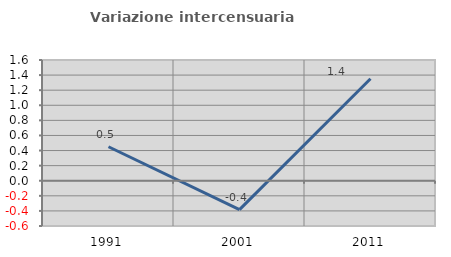
| Category | Variazione intercensuaria annua |
|---|---|
| 1991.0 | 0.45 |
| 2001.0 | -0.384 |
| 2011.0 | 1.352 |